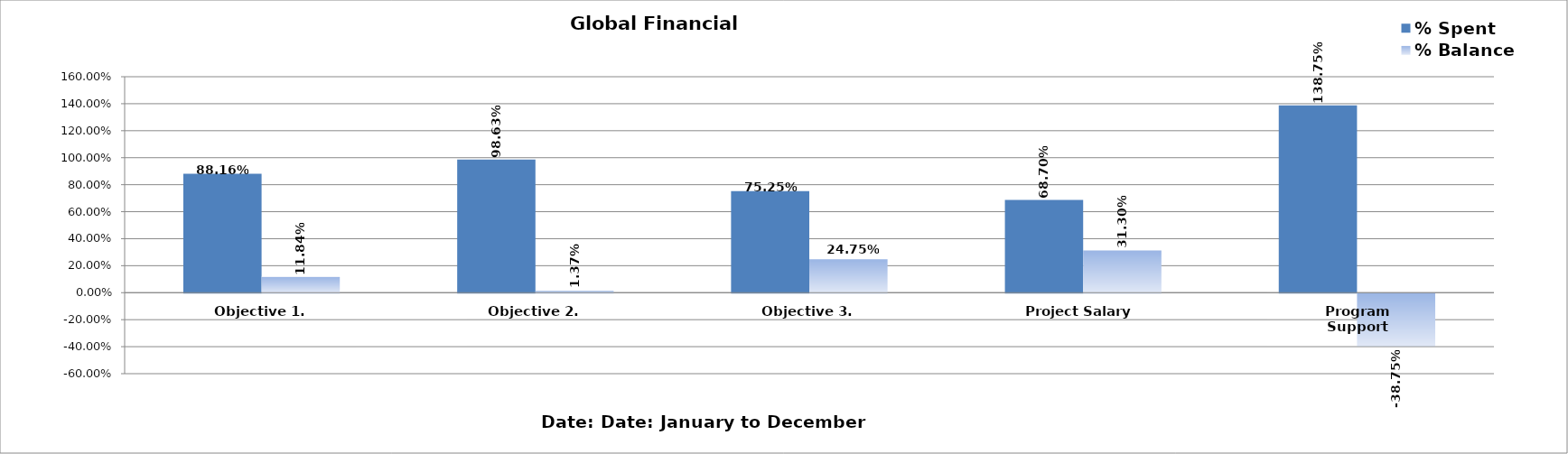
| Category |  % Spent   |  % Balance   |
|---|---|---|
| Objective 1. | 0.882 | 0.118 |
| Objective 2. | 0.986 | 0.014 |
| Objective 3. | 0.752 | 0.248 |
| Project Salary  | 0.687 | 0.313 |
| Program Support | 1.388 | -0.388 |